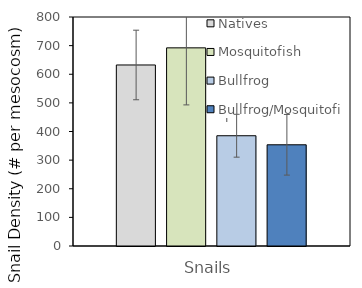
| Category | Natives | Mosquitofish | Bullfrog | Bullfrog/Mosquitofish |
|---|---|---|---|---|
| Snails | 632.4 | 692.2 | 385.2 | 353.6 |